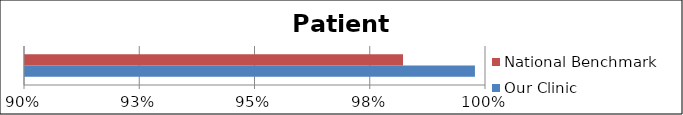
| Category | Our Clinic   | National Benchmark   |
|---|---|---|
| 0 | 0.998 | 0.982 |